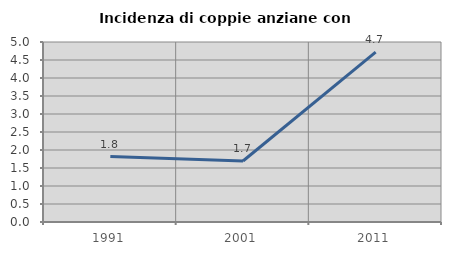
| Category | Incidenza di coppie anziane con figli |
|---|---|
| 1991.0 | 1.818 |
| 2001.0 | 1.695 |
| 2011.0 | 4.717 |